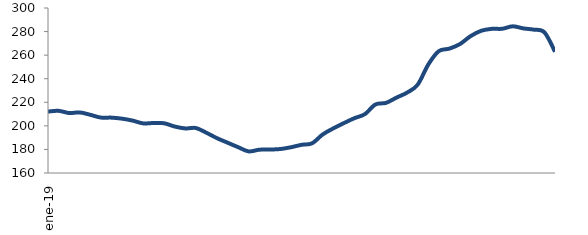
| Category | Series 0 |
|---|---|
| 2019-01-01 | 212.101 |
| 2019-02-01 | 212.755 |
| 2019-03-01 | 210.872 |
| 2019-04-01 | 211.394 |
| 2019-05-01 | 209.393 |
| 2019-06-01 | 207.032 |
| 2019-07-01 | 206.974 |
| 2019-08-01 | 206.107 |
| 2019-09-01 | 204.488 |
| 2019-10-01 | 202.111 |
| 2019-11-01 | 202.424 |
| 2019-12-01 | 202.177 |
| 2020-01-01 | 199.409 |
| 2020-02-01 | 197.826 |
| 2020-03-01 | 198.161 |
| 2020-04-01 | 194.123 |
| 2020-05-01 | 189.538 |
| 2020-06-01 | 185.731 |
| 2020-07-01 | 181.914 |
| 2020-08-01 | 178.343 |
| 2020-09-01 | 179.758 |
| 2020-10-01 | 179.9 |
| 2020-11-01 | 180.346 |
| 2020-12-01 | 181.827 |
| 2021-01-01 | 183.909 |
| 2021-02-01 | 185.191 |
| 2021-03-01 | 192.66 |
| 2021-04-01 | 197.814 |
| 2021-05-01 | 202.28 |
| 2021-06-01 | 206.474 |
| 2021-07-01 | 209.951 |
| 2021-08-01 | 218.146 |
| 2021-09-01 | 219.495 |
| 2021-10-01 | 224.001 |
| 2021-11-01 | 228.234 |
| 2021-12-01 | 234.966 |
| 2022-01-01 | 252.005 |
| 2022-02-01 | 263.393 |
| 2022-03-01 | 265.526 |
| 2022-04-01 | 269.383 |
| 2022-05-01 | 276.084 |
| 2022-06-01 | 280.635 |
| 2022-07-01 | 282.3 |
| 2022-08-01 | 282.377 |
| 2022-09-01 | 284.458 |
| 2022-10-01 | 282.697 |
| 2022-11-01 | 281.631 |
| 2022-12-01 | 279.359 |
| 2023-01-01 | 262.911 |